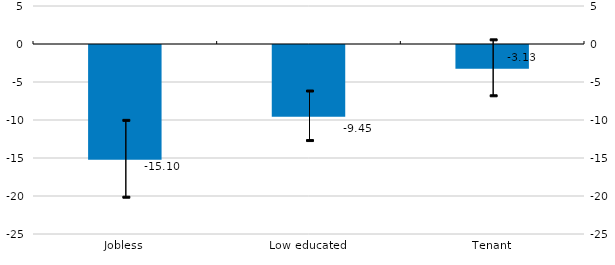
| Category | Estimate |
|---|---|
| Jobless | -15.103 |
| Low educated | -9.446 |
| Tenant | -3.134 |